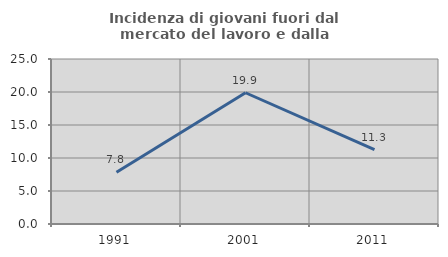
| Category | Incidenza di giovani fuori dal mercato del lavoro e dalla formazione  |
|---|---|
| 1991.0 | 7.85 |
| 2001.0 | 19.886 |
| 2011.0 | 11.282 |